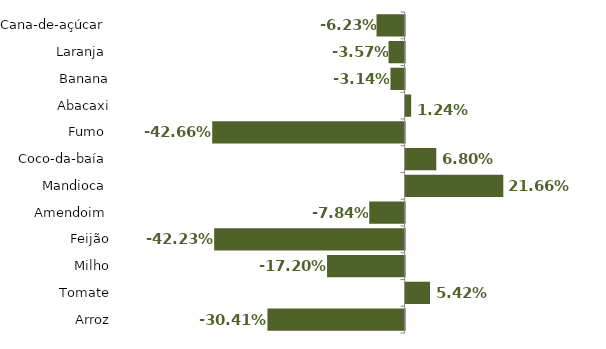
| Category | Series 0 |
|---|---|
| Cana-de-açúcar  | -0.062 |
| Laranja  | -0.036 |
| Banana | -0.031 |
| Abacaxi | 0.012 |
| Fumo  | -0.427 |
| Coco-da-baía  | 0.068 |
| Mandioca  | 0.217 |
| Amendoim  | -0.078 |
| Feijão | -0.422 |
| Milho | -0.172 |
| Tomate | 0.054 |
| Arroz | -0.304 |